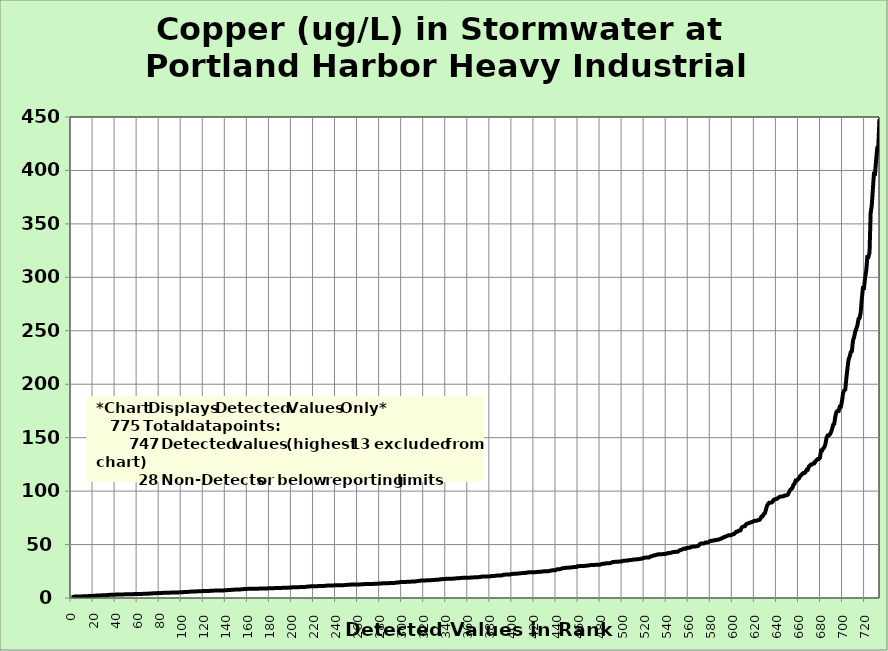
| Category | Copper |
|---|---|
| 0.0 | 0.838 |
| 1.0 | 0.856 |
| 2.0 | 0.91 |
| 3.0 | 1.34 |
| 4.0 | 1.34 |
| 5.0 | 1.38 |
| 6.0 | 1.38 |
| 7.0 | 1.47 |
| 8.0 | 1.49 |
| 9.0 | 1.5 |
| 10.0 | 1.56 |
| 11.0 | 1.57 |
| 12.0 | 1.61 |
| 13.0 | 1.64 |
| 14.0 | 1.7 |
| 15.0 | 1.74 |
| 16.0 | 1.91 |
| 17.0 | 1.93 |
| 18.0 | 1.93 |
| 19.0 | 1.98 |
| 20.0 | 2 |
| 21.0 | 2.04 |
| 22.0 | 2.1 |
| 23.0 | 2.34 |
| 24.0 | 2.39 |
| 25.0 | 2.4 |
| 26.0 | 2.4 |
| 27.0 | 2.47 |
| 28.0 | 2.54 |
| 29.0 | 2.55 |
| 30.0 | 2.57 |
| 31.0 | 2.63 |
| 32.0 | 2.7 |
| 33.0 | 2.83 |
| 34.0 | 2.9 |
| 35.0 | 3.03 |
| 36.0 | 3.07 |
| 37.0 | 3.07 |
| 38.0 | 3.09 |
| 39.0 | 3.1 |
| 40.0 | 3.17 |
| 41.0 | 3.2 |
| 42.0 | 3.21 |
| 43.0 | 3.3 |
| 44.0 | 3.33 |
| 45.0 | 3.38 |
| 46.0 | 3.38 |
| 47.0 | 3.38 |
| 48.0 | 3.41 |
| 49.0 | 3.47 |
| 50.0 | 3.5 |
| 51.0 | 3.5 |
| 52.0 | 3.52 |
| 53.0 | 3.55 |
| 54.0 | 3.59 |
| 55.0 | 3.6 |
| 56.0 | 3.6 |
| 57.0 | 3.68 |
| 58.0 | 3.7 |
| 59.0 | 3.7 |
| 60.0 | 3.75 |
| 61.0 | 3.8 |
| 62.0 | 3.8 |
| 63.0 | 3.8 |
| 64.0 | 3.84 |
| 65.0 | 3.87 |
| 66.0 | 3.9 |
| 67.0 | 3.9 |
| 68.0 | 4 |
| 69.0 | 4 |
| 70.0 | 4.1 |
| 71.0 | 4.2 |
| 72.0 | 4.27 |
| 73.0 | 4.29 |
| 74.0 | 4.35 |
| 75.0 | 4.42 |
| 76.0 | 4.5 |
| 77.0 | 4.5 |
| 78.0 | 4.62 |
| 79.0 | 4.63 |
| 80.0 | 4.64 |
| 81.0 | 4.65 |
| 82.0 | 4.69 |
| 83.0 | 4.8 |
| 84.0 | 4.9 |
| 85.0 | 4.9 |
| 86.0 | 4.9 |
| 87.0 | 4.9 |
| 88.0 | 4.94 |
| 89.0 | 4.99 |
| 90.0 | 5.03 |
| 91.0 | 5.06 |
| 92.0 | 5.07 |
| 93.0 | 5.08 |
| 94.0 | 5.1 |
| 95.0 | 5.1 |
| 96.0 | 5.2 |
| 97.0 | 5.22 |
| 98.0 | 5.31 |
| 99.0 | 5.34 |
| 100.0 | 5.4 |
| 101.0 | 5.4 |
| 102.0 | 5.56 |
| 103.0 | 5.6 |
| 104.0 | 5.64 |
| 105.0 | 5.71 |
| 106.0 | 5.74 |
| 107.0 | 5.85 |
| 108.0 | 5.96 |
| 109.0 | 5.97 |
| 110.0 | 5.98 |
| 111.0 | 6 |
| 112.0 | 6.1 |
| 113.0 | 6.1 |
| 114.0 | 6.24 |
| 115.0 | 6.31 |
| 116.0 | 6.4 |
| 117.0 | 6.4 |
| 118.0 | 6.4 |
| 119.0 | 6.45 |
| 120.0 | 6.47 |
| 121.0 | 6.5 |
| 122.0 | 6.52 |
| 123.0 | 6.53 |
| 124.0 | 6.6 |
| 125.0 | 6.63 |
| 126.0 | 6.8 |
| 127.0 | 6.84 |
| 128.0 | 6.88 |
| 129.0 | 6.9 |
| 130.0 | 6.9 |
| 131.0 | 6.96 |
| 132.0 | 6.98 |
| 133.0 | 7 |
| 134.0 | 7 |
| 135.0 | 7 |
| 136.0 | 7.01 |
| 137.0 | 7.08 |
| 138.0 | 7.1 |
| 139.0 | 7.23 |
| 140.0 | 7.27 |
| 141.0 | 7.32 |
| 142.0 | 7.4 |
| 143.0 | 7.4 |
| 144.0 | 7.58 |
| 145.0 | 7.6 |
| 146.0 | 7.7 |
| 147.0 | 7.75 |
| 148.0 | 7.8 |
| 149.0 | 7.96 |
| 150.0 | 7.98 |
| 151.0 | 8 |
| 152.0 | 8 |
| 153.0 | 8.06 |
| 154.0 | 8.08 |
| 155.0 | 8.27 |
| 156.0 | 8.3 |
| 157.0 | 8.38 |
| 158.0 | 8.5 |
| 159.0 | 8.52 |
| 160.0 | 8.55 |
| 161.0 | 8.6 |
| 162.0 | 8.6 |
| 163.0 | 8.61 |
| 164.0 | 8.62 |
| 165.0 | 8.67 |
| 166.0 | 8.72 |
| 167.0 | 8.74 |
| 168.0 | 8.75 |
| 169.0 | 8.76 |
| 170.0 | 8.77 |
| 171.0 | 8.78 |
| 172.0 | 8.89 |
| 173.0 | 8.89 |
| 174.0 | 8.9 |
| 175.0 | 8.9 |
| 176.0 | 8.93 |
| 177.0 | 9 |
| 178.0 | 9 |
| 179.0 | 9.07 |
| 180.0 | 9.09 |
| 181.0 | 9.1 |
| 182.0 | 9.13 |
| 183.0 | 9.16 |
| 184.0 | 9.2 |
| 185.0 | 9.34 |
| 186.0 | 9.36 |
| 187.0 | 9.38 |
| 188.0 | 9.39 |
| 189.0 | 9.4 |
| 190.0 | 9.43 |
| 191.0 | 9.49 |
| 192.0 | 9.5 |
| 193.0 | 9.5 |
| 194.0 | 9.5 |
| 195.0 | 9.6 |
| 196.0 | 9.62 |
| 197.0 | 9.7 |
| 198.0 | 9.79 |
| 199.0 | 9.9 |
| 200.0 | 9.92 |
| 201.0 | 9.99 |
| 202.0 | 10 |
| 203.0 | 10 |
| 204.0 | 10 |
| 205.0 | 10.1 |
| 206.0 | 10.1 |
| 207.0 | 10.2 |
| 208.0 | 10.2 |
| 209.0 | 10.3 |
| 210.0 | 10.3 |
| 211.0 | 10.4 |
| 212.0 | 10.4 |
| 213.0 | 10.5 |
| 214.0 | 10.7 |
| 215.0 | 10.8 |
| 216.0 | 10.8 |
| 217.0 | 10.9 |
| 218.0 | 11 |
| 219.0 | 11 |
| 220.0 | 11 |
| 221.0 | 11 |
| 222.0 | 11 |
| 223.0 | 11 |
| 224.0 | 11.2 |
| 225.0 | 11.2 |
| 226.0 | 11.2 |
| 227.0 | 11.2 |
| 228.0 | 11.3 |
| 229.0 | 11.3 |
| 230.0 | 11.4 |
| 231.0 | 11.5 |
| 232.0 | 11.6 |
| 233.0 | 11.7 |
| 234.0 | 11.7 |
| 235.0 | 11.7 |
| 236.0 | 11.7 |
| 237.0 | 11.8 |
| 238.0 | 11.8 |
| 239.0 | 11.9 |
| 240.0 | 11.9 |
| 241.0 | 12 |
| 242.0 | 12 |
| 243.0 | 12 |
| 244.0 | 12 |
| 245.0 | 12 |
| 246.0 | 12 |
| 247.0 | 12 |
| 248.0 | 12.1 |
| 249.0 | 12.2 |
| 250.0 | 12.3 |
| 251.0 | 12.4 |
| 252.0 | 12.4 |
| 253.0 | 12.5 |
| 254.0 | 12.6 |
| 255.0 | 12.6 |
| 256.0 | 12.6 |
| 257.0 | 12.6 |
| 258.0 | 12.6 |
| 259.0 | 12.7 |
| 260.0 | 12.7 |
| 261.0 | 12.7 |
| 262.0 | 12.7 |
| 263.0 | 12.8 |
| 264.0 | 12.8 |
| 265.0 | 12.9 |
| 266.0 | 13 |
| 267.0 | 13 |
| 268.0 | 13 |
| 269.0 | 13 |
| 270.0 | 13 |
| 271.0 | 13 |
| 272.0 | 13.1 |
| 273.0 | 13.1 |
| 274.0 | 13.1 |
| 275.0 | 13.3 |
| 276.0 | 13.4 |
| 277.0 | 13.4 |
| 278.0 | 13.4 |
| 279.0 | 13.5 |
| 280.0 | 13.5 |
| 281.0 | 13.5 |
| 282.0 | 13.7 |
| 283.0 | 13.7 |
| 284.0 | 13.7 |
| 285.0 | 13.7 |
| 286.0 | 13.8 |
| 287.0 | 13.8 |
| 288.0 | 13.9 |
| 289.0 | 14 |
| 290.0 | 14 |
| 291.0 | 14 |
| 292.0 | 14.1 |
| 293.0 | 14.1 |
| 294.0 | 14.3 |
| 295.0 | 14.5 |
| 296.0 | 14.5 |
| 297.0 | 14.6 |
| 298.0 | 14.9 |
| 299.0 | 15 |
| 300.0 | 15 |
| 301.0 | 15 |
| 302.0 | 15 |
| 303.0 | 15 |
| 304.0 | 15.1 |
| 305.0 | 15.1 |
| 306.0 | 15.2 |
| 307.0 | 15.3 |
| 308.0 | 15.3 |
| 309.0 | 15.4 |
| 310.0 | 15.5 |
| 311.0 | 15.5 |
| 312.0 | 15.5 |
| 313.0 | 15.7 |
| 314.0 | 15.8 |
| 315.0 | 16 |
| 316.0 | 16.1 |
| 317.0 | 16.3 |
| 318.0 | 16.4 |
| 319.0 | 16.4 |
| 320.0 | 16.4 |
| 321.0 | 16.4 |
| 322.0 | 16.5 |
| 323.0 | 16.5 |
| 324.0 | 16.6 |
| 325.0 | 16.6 |
| 326.0 | 16.6 |
| 327.0 | 16.8 |
| 328.0 | 16.8 |
| 329.0 | 16.9 |
| 330.0 | 17 |
| 331.0 | 17 |
| 332.0 | 17 |
| 333.0 | 17.2 |
| 334.0 | 17.3 |
| 335.0 | 17.6 |
| 336.0 | 17.6 |
| 337.0 | 17.7 |
| 338.0 | 17.8 |
| 339.0 | 17.8 |
| 340.0 | 18 |
| 341.0 | 18 |
| 342.0 | 18 |
| 343.0 | 18 |
| 344.0 | 18.1 |
| 345.0 | 18.1 |
| 346.0 | 18.1 |
| 347.0 | 18.2 |
| 348.0 | 18.3 |
| 349.0 | 18.4 |
| 350.0 | 18.4 |
| 351.0 | 18.5 |
| 352.0 | 18.6 |
| 353.0 | 18.8 |
| 354.0 | 18.8 |
| 355.0 | 18.9 |
| 356.0 | 18.9 |
| 357.0 | 19 |
| 358.0 | 19 |
| 359.0 | 19 |
| 360.0 | 19 |
| 361.0 | 19 |
| 362.0 | 19.1 |
| 363.0 | 19.2 |
| 364.0 | 19.2 |
| 365.0 | 19.3 |
| 366.0 | 19.3 |
| 367.0 | 19.4 |
| 368.0 | 19.4 |
| 369.0 | 19.5 |
| 370.0 | 19.6 |
| 371.0 | 19.7 |
| 372.0 | 20 |
| 373.0 | 20 |
| 374.0 | 20 |
| 375.0 | 20 |
| 376.0 | 20.1 |
| 377.0 | 20.2 |
| 378.0 | 20.2 |
| 379.0 | 20.2 |
| 380.0 | 20.3 |
| 381.0 | 20.5 |
| 382.0 | 20.6 |
| 383.0 | 20.6 |
| 384.0 | 20.7 |
| 385.0 | 20.9 |
| 386.0 | 21 |
| 387.0 | 21 |
| 388.0 | 21 |
| 389.0 | 21 |
| 390.0 | 21 |
| 391.0 | 21.5 |
| 392.0 | 21.7 |
| 393.0 | 21.8 |
| 394.0 | 22 |
| 395.0 | 22 |
| 396.0 | 22 |
| 397.0 | 22 |
| 398.0 | 22 |
| 399.0 | 22.5 |
| 400.0 | 22.5 |
| 401.0 | 22.7 |
| 402.0 | 22.7 |
| 403.0 | 22.7 |
| 404.0 | 22.7 |
| 405.0 | 23 |
| 406.0 | 23 |
| 407.0 | 23.1 |
| 408.0 | 23.2 |
| 409.0 | 23.3 |
| 410.0 | 23.3 |
| 411.0 | 23.3 |
| 412.0 | 23.4 |
| 413.0 | 23.8 |
| 414.0 | 23.9 |
| 415.0 | 24 |
| 416.0 | 24 |
| 417.0 | 24 |
| 418.0 | 24.2 |
| 419.0 | 24.2 |
| 420.0 | 24.2 |
| 421.0 | 24.2 |
| 422.0 | 24.3 |
| 423.0 | 24.3 |
| 424.0 | 24.5 |
| 425.0 | 24.5 |
| 426.0 | 24.5 |
| 427.0 | 24.9 |
| 428.0 | 24.9 |
| 429.0 | 25 |
| 430.0 | 25 |
| 431.0 | 25 |
| 432.0 | 25 |
| 433.0 | 25.1 |
| 434.0 | 25.6 |
| 435.0 | 25.6 |
| 436.0 | 25.9 |
| 437.0 | 26 |
| 438.0 | 26 |
| 439.0 | 26 |
| 440.0 | 26.6 |
| 441.0 | 27 |
| 442.0 | 27 |
| 443.0 | 27 |
| 444.0 | 27.3 |
| 445.0 | 27.7 |
| 446.0 | 27.9 |
| 447.0 | 28 |
| 448.0 | 28.2 |
| 449.0 | 28.3 |
| 450.0 | 28.4 |
| 451.0 | 28.4 |
| 452.0 | 28.5 |
| 453.0 | 28.6 |
| 454.0 | 28.7 |
| 455.0 | 28.8 |
| 456.0 | 29 |
| 457.0 | 29 |
| 458.0 | 29 |
| 459.0 | 29.7 |
| 460.0 | 29.7 |
| 461.0 | 29.9 |
| 462.0 | 30 |
| 463.0 | 30 |
| 464.0 | 30 |
| 465.0 | 30 |
| 466.0 | 30.1 |
| 467.0 | 30.2 |
| 468.0 | 30.3 |
| 469.0 | 30.4 |
| 470.0 | 30.6 |
| 471.0 | 30.8 |
| 472.0 | 30.8 |
| 473.0 | 30.8 |
| 474.0 | 30.9 |
| 475.0 | 31 |
| 476.0 | 31 |
| 477.0 | 31 |
| 478.0 | 31 |
| 479.0 | 31 |
| 480.0 | 31.4 |
| 481.0 | 31.8 |
| 482.0 | 32 |
| 483.0 | 32 |
| 484.0 | 32.3 |
| 485.0 | 32.4 |
| 486.0 | 32.5 |
| 487.0 | 32.6 |
| 488.0 | 32.6 |
| 489.0 | 32.7 |
| 490.0 | 33.2 |
| 491.0 | 33.6 |
| 492.0 | 33.6 |
| 493.0 | 33.8 |
| 494.0 | 33.9 |
| 495.0 | 34 |
| 496.0 | 34 |
| 497.0 | 34.1 |
| 498.0 | 34.1 |
| 499.0 | 34.1 |
| 500.0 | 34.7 |
| 501.0 | 34.8 |
| 502.0 | 34.9 |
| 503.0 | 35 |
| 504.0 | 35 |
| 505.0 | 35 |
| 506.0 | 35.5 |
| 507.0 | 35.5 |
| 508.0 | 35.6 |
| 509.0 | 35.7 |
| 510.0 | 36 |
| 511.0 | 36.1 |
| 512.0 | 36.1 |
| 513.0 | 36.2 |
| 514.0 | 36.3 |
| 515.0 | 36.5 |
| 516.0 | 36.6 |
| 517.0 | 36.8 |
| 518.0 | 37 |
| 519.0 | 37.6 |
| 520.0 | 37.6 |
| 521.0 | 37.8 |
| 522.0 | 38 |
| 523.0 | 38 |
| 524.0 | 38 |
| 525.0 | 38.7 |
| 526.0 | 39 |
| 527.0 | 39.3 |
| 528.0 | 39.7 |
| 529.0 | 40 |
| 530.0 | 40.1 |
| 531.0 | 40.6 |
| 532.0 | 40.7 |
| 533.0 | 40.9 |
| 534.0 | 40.9 |
| 535.0 | 40.9 |
| 536.0 | 41 |
| 537.0 | 41.1 |
| 538.0 | 41.2 |
| 539.0 | 41.5 |
| 540.0 | 41.5 |
| 541.0 | 42 |
| 542.0 | 42.1 |
| 543.0 | 42.1 |
| 544.0 | 42.4 |
| 545.0 | 42.8 |
| 546.0 | 43 |
| 547.0 | 43 |
| 548.0 | 43.2 |
| 549.0 | 43.3 |
| 550.0 | 43.3 |
| 551.0 | 44 |
| 552.0 | 44.8 |
| 553.0 | 45 |
| 554.0 | 45.4 |
| 555.0 | 46 |
| 556.0 | 46 |
| 557.0 | 46 |
| 558.0 | 46.8 |
| 559.0 | 47 |
| 560.0 | 47 |
| 561.0 | 47.1 |
| 562.0 | 47.7 |
| 563.0 | 47.9 |
| 564.0 | 48.1 |
| 565.0 | 48.1 |
| 566.0 | 48.2 |
| 567.0 | 48.3 |
| 568.0 | 48.7 |
| 569.0 | 49 |
| 570.0 | 50.4 |
| 571.0 | 51 |
| 572.0 | 51 |
| 573.0 | 51 |
| 574.0 | 51.1 |
| 575.0 | 51.9 |
| 576.0 | 52 |
| 577.0 | 52 |
| 578.0 | 52.2 |
| 579.0 | 53.2 |
| 580.0 | 53.3 |
| 581.0 | 53.6 |
| 582.0 | 53.6 |
| 583.0 | 54 |
| 584.0 | 54 |
| 585.0 | 54.4 |
| 586.0 | 54.5 |
| 587.0 | 54.6 |
| 588.0 | 55 |
| 589.0 | 55.6 |
| 590.0 | 55.8 |
| 591.0 | 56.4 |
| 592.0 | 57 |
| 593.0 | 57.2 |
| 594.0 | 57.8 |
| 595.0 | 58.1 |
| 596.0 | 58.7 |
| 597.0 | 58.7 |
| 598.0 | 58.8 |
| 599.0 | 59 |
| 600.0 | 59.7 |
| 601.0 | 59.8 |
| 602.0 | 60.8 |
| 603.0 | 61.9 |
| 604.0 | 62 |
| 605.0 | 62.9 |
| 606.0 | 62.9 |
| 607.0 | 63.3 |
| 608.0 | 66 |
| 609.0 | 66.7 |
| 610.0 | 67 |
| 611.0 | 67.2 |
| 612.0 | 69 |
| 613.0 | 69.6 |
| 614.0 | 69.9 |
| 615.0 | 70.2 |
| 616.0 | 70.7 |
| 617.0 | 70.9 |
| 618.0 | 71.5 |
| 619.0 | 71.9 |
| 620.0 | 72.3 |
| 621.0 | 72.3 |
| 622.0 | 72.5 |
| 623.0 | 73 |
| 624.0 | 73 |
| 625.0 | 74.1 |
| 626.0 | 76.2 |
| 627.0 | 76.4 |
| 628.0 | 78.6 |
| 629.0 | 79.2 |
| 630.0 | 82.6 |
| 631.0 | 86.3 |
| 632.0 | 88 |
| 633.0 | 89.1 |
| 634.0 | 89.2 |
| 635.0 | 89.3 |
| 636.0 | 90 |
| 637.0 | 91.8 |
| 638.0 | 92.3 |
| 639.0 | 92.6 |
| 640.0 | 92.7 |
| 641.0 | 93.7 |
| 642.0 | 94.4 |
| 643.0 | 94.8 |
| 644.0 | 95 |
| 645.0 | 95 |
| 646.0 | 95.2 |
| 647.0 | 96 |
| 648.0 | 96 |
| 649.0 | 96.2 |
| 650.0 | 96.8 |
| 651.0 | 99 |
| 652.0 | 101 |
| 653.0 | 102 |
| 654.0 | 103 |
| 655.0 | 106 |
| 656.0 | 107 |
| 657.0 | 110 |
| 658.0 | 110 |
| 659.0 | 111 |
| 660.0 | 112 |
| 661.0 | 114 |
| 662.0 | 115 |
| 663.0 | 116 |
| 664.0 | 117 |
| 665.0 | 117 |
| 666.0 | 118 |
| 667.0 | 120 |
| 668.0 | 120 |
| 669.0 | 123 |
| 670.0 | 124 |
| 671.0 | 125 |
| 672.0 | 125 |
| 673.0 | 126 |
| 674.0 | 126 |
| 675.0 | 128 |
| 676.0 | 129 |
| 677.0 | 130 |
| 678.0 | 130 |
| 679.0 | 131 |
| 680.0 | 138 |
| 681.0 | 138 |
| 682.0 | 140 |
| 683.0 | 141 |
| 684.0 | 144 |
| 685.0 | 150 |
| 686.0 | 152 |
| 687.0 | 152 |
| 688.0 | 153 |
| 689.0 | 155 |
| 690.0 | 158 |
| 691.0 | 162 |
| 692.0 | 163 |
| 693.0 | 170 |
| 694.0 | 174 |
| 695.0 | 175 |
| 696.0 | 175 |
| 697.0 | 179 |
| 698.0 | 179 |
| 699.0 | 184 |
| 700.0 | 192 |
| 701.0 | 194 |
| 702.0 | 195 |
| 703.0 | 206 |
| 704.0 | 215 |
| 705.0 | 223 |
| 706.0 | 226 |
| 707.0 | 230 |
| 708.0 | 231 |
| 709.0 | 241 |
| 710.0 | 244 |
| 711.0 | 249 |
| 712.0 | 252 |
| 713.0 | 255 |
| 714.0 | 261 |
| 715.0 | 262 |
| 716.0 | 267 |
| 717.0 | 280 |
| 718.0 | 290 |
| 719.0 | 290 |
| 720.0 | 300 |
| 721.0 | 306 |
| 722.0 | 319 |
| 723.0 | 319 |
| 724.0 | 323 |
| 725.0 | 360 |
| 726.0 | 367 |
| 727.0 | 382 |
| 728.0 | 397 |
| 729.0 | 397 |
| 730.0 | 410 |
| 731.0 | 421 |
| 732.0 | 423 |
| 733.0 | 448 |